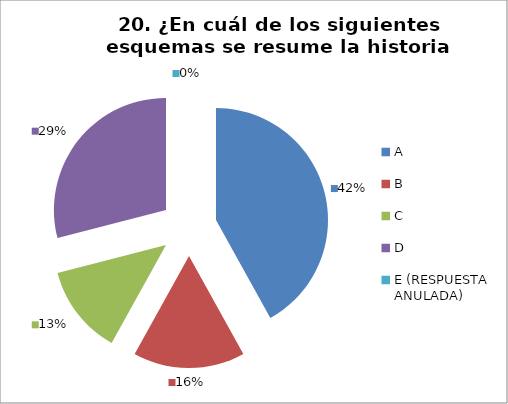
| Category | CANTIDAD DE RESPUESTAS PREGUNTA (20) | PORCENTAJE |
|---|---|---|
| A | 13 | 0.419 |
| B | 5 | 0.161 |
| C | 4 | 0.129 |
| D | 9 | 0.29 |
| E (RESPUESTA ANULADA) | 0 | 0 |